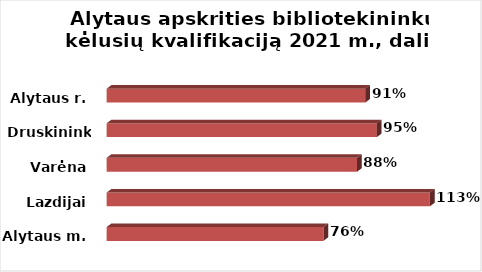
| Category | Series 0 |
|---|---|
| Alytaus m. | 0.76 |
| Lazdijai | 1.133 |
| Varėna | 0.878 |
| Druskininkai | 0.947 |
| Alytaus r. | 0.907 |